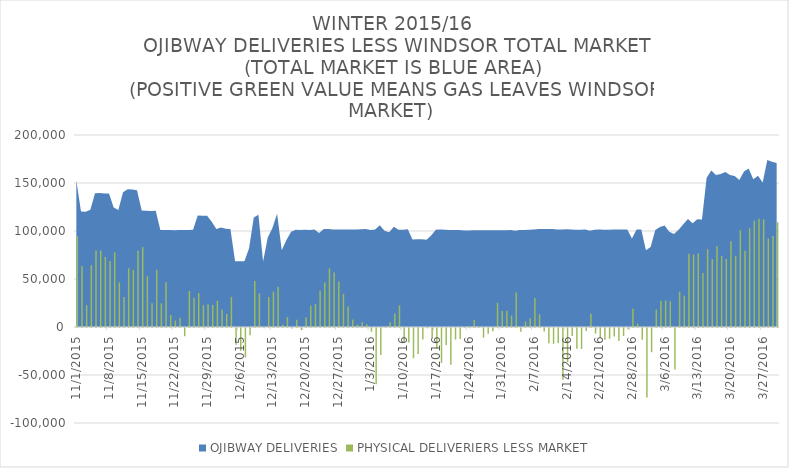
| Category | PHYSICAL DELIVERIERS LESS MARKET |
|---|---|
| 2013-11-01 | 94411.239 |
| 2013-11-02 | 63658.885 |
| 2013-11-03 | 22739.096 |
| 2013-11-04 | 64500.423 |
| 2013-11-05 | 79805.911 |
| 2013-11-06 | 79725.721 |
| 2013-11-07 | 73046.273 |
| 2013-11-08 | 68796.338 |
| 2013-11-09 | 77774.975 |
| 2013-11-10 | 46474.33 |
| 2013-11-11 | 31199.018 |
| 2013-11-12 | 61183.933 |
| 2013-11-13 | 59544.418 |
| 2013-11-14 | 79548.469 |
| 2013-11-15 | 83263.527 |
| 2013-11-16 | 52877.751 |
| 2013-11-17 | 24620.941 |
| 2013-11-18 | 59661.259 |
| 2013-11-19 | 24642.606 |
| 2013-11-20 | 46518.379 |
| 2013-11-21 | 12525.33 |
| 2013-11-22 | 6652.255 |
| 2013-11-23 | 9713.756 |
| 2013-11-24 | -8525.036 |
| 2013-11-25 | 37485.815 |
| 2013-11-26 | 30348.683 |
| 2013-11-27 | 35340.077 |
| 2013-11-28 | 22702.521 |
| 2013-11-29 | 23781.53 |
| 2013-11-30 | 22954.071 |
| 2013-12-01 | 27419.217 |
| 2013-12-02 | 18261.064 |
| 2013-12-03 | 13632.879 |
| 2013-12-04 | 31347.403 |
| 2013-12-05 | -17411.48 |
| 2013-12-06 | -23793.947 |
| 2013-12-07 | -30554.671 |
| 2013-12-08 | -7636.544 |
| 2013-12-09 | 48046.243 |
| 2013-12-10 | 35022.605 |
| 2013-12-11 | -303.425 |
| 2013-12-12 | 31271.899 |
| 2013-12-13 | 36760.246 |
| 2013-12-14 | 41856.922 |
| 2013-12-15 | 2427.392 |
| 2013-12-16 | 10333.916 |
| 2013-12-17 | -525.734 |
| 2013-12-18 | 7541.849 |
| 2013-12-19 | -2167.438 |
| 2013-12-20 | 10235.686 |
| 2013-12-21 | 22190.608 |
| 2013-12-22 | 23868.23 |
| 2013-12-23 | 37851.301 |
| 2013-12-24 | 46398.489 |
| 2013-12-25 | 60983.99 |
| 2013-12-26 | 56777.845 |
| 2013-12-27 | 47316.206 |
| 2013-12-28 | 34581.412 |
| 2013-12-29 | 21305.896 |
| 2013-12-30 | 7683.95 |
| 2013-12-31 | 2470.634 |
| 2014-01-01 | 5146.828 |
| 2014-01-02 | 2932.752 |
| 2014-01-03 | -3947.834 |
| 2014-01-04 | -58682.725 |
| 2014-01-05 | -28048.458 |
| 2014-01-06 | 94.406 |
| 2014-01-07 | 5002.917 |
| 2014-01-08 | 14046.429 |
| 2014-01-09 | 22528.374 |
| 2014-01-10 | -14298.854 |
| 2014-01-11 | -15224.585 |
| 2014-01-12 | -31474.842 |
| 2014-01-13 | -26982.601 |
| 2014-01-14 | -12103.628 |
| 2014-01-15 | -369.718 |
| 2014-01-16 | -10612.829 |
| 2014-01-17 | -21679.415 |
| 2014-01-18 | -36434.792 |
| 2014-01-19 | -17778.816 |
| 2014-01-20 | -38156.657 |
| 2014-01-21 | -12058.603 |
| 2014-01-22 | -11474.677 |
| 2014-01-23 | -49.313 |
| 2014-01-24 | -230.254 |
| 2014-01-25 | 7554.463 |
| 2014-01-26 | 378.901 |
| 2014-01-27 | -10115.923 |
| 2014-01-28 | -6089.855 |
| 2014-01-29 | -3330.933 |
| 2014-01-30 | 25316.918 |
| 2014-01-31 | 16755.848 |
| 2014-02-01 | 16927.072 |
| 2014-02-02 | 12018.787 |
| 2014-02-03 | 35843.867 |
| 2014-02-04 | -3986.063 |
| 2014-02-05 | 5823.173 |
| 2014-02-06 | 9181.385 |
| 2014-02-07 | 30139.214 |
| 2014-02-08 | 13209.304 |
| 2014-02-09 | -3557.27 |
| 2014-02-10 | -15896.511 |
| 2014-02-11 | -16468.467 |
| 2014-02-12 | -15621.521 |
| 2014-02-13 | -53846.982 |
| 2014-02-14 | -35593.53 |
| 2014-02-15 | -8263.63 |
| 2014-02-16 | -21664.897 |
| 2014-02-17 | -21864.253 |
| 2014-02-18 | -3176.284 |
| 2014-02-19 | 13732.546 |
| 2014-02-20 | -5839.497 |
| 2014-02-21 | -10007.457 |
| 2014-02-22 | -12269.031 |
| 2014-02-23 | -11205.41 |
| 2014-02-24 | -8870.633 |
| 2014-02-25 | -13601.944 |
| 2014-02-26 | -8205.424 |
| 2014-02-27 | -1271.967 |
| 2014-02-28 | 18919.812 |
| 2014-03-01 | 3626.511 |
| 2014-03-02 | -12283.436 |
| 2014-03-03 | -72376.27 |
| 2014-03-04 | -25212.425 |
| 2014-03-05 | 17968.281 |
| 2014-03-06 | 27415.999 |
| 2014-03-07 | 27632.587 |
| 2014-03-08 | 26949.722 |
| 2014-03-09 | -43185.391 |
| 2014-03-10 | 36790.124 |
| 2014-03-11 | 32690.531 |
| 2014-03-12 | 76195.132 |
| 2014-03-13 | 75438.941 |
| 2014-03-14 | 76642.89 |
| 2014-03-15 | 56130.631 |
| 2014-03-16 | 80985.471 |
| 2014-03-17 | 70713.272 |
| 2014-03-18 | 84222.753 |
| 2014-03-19 | 73939.798 |
| 2014-03-20 | 70882.474 |
| 2014-03-21 | 89282.958 |
| 2014-03-22 | 74312.358 |
| 2014-03-23 | 100779.233 |
| 2014-03-24 | 79485.301 |
| 2014-03-25 | 102824.907 |
| 2014-03-26 | 110721.334 |
| 2014-03-27 | 112785.622 |
| 2014-03-28 | 112273.477 |
| 2014-03-29 | 92354.167 |
| 2014-03-30 | 94882.169 |